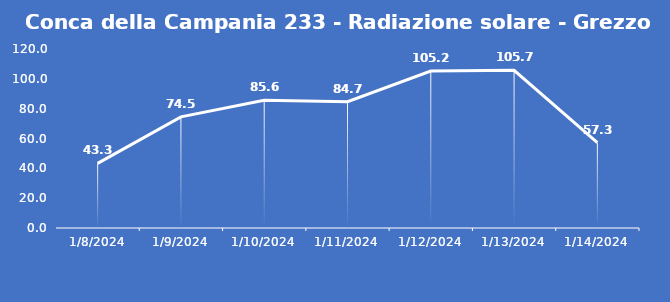
| Category | Conca della Campania 233 - Radiazione solare - Grezzo (W/m2) |
|---|---|
| 1/8/24 | 43.3 |
| 1/9/24 | 74.5 |
| 1/10/24 | 85.6 |
| 1/11/24 | 84.7 |
| 1/12/24 | 105.2 |
| 1/13/24 | 105.7 |
| 1/14/24 | 57.3 |